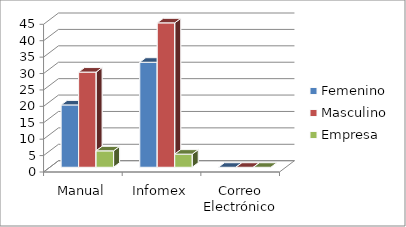
| Category | Femenino | Masculino | Empresa |
|---|---|---|---|
| 0 | 19 | 29 | 5 |
| 1 | 32 | 44 | 4 |
| 2 | 0 | 0 | 0 |